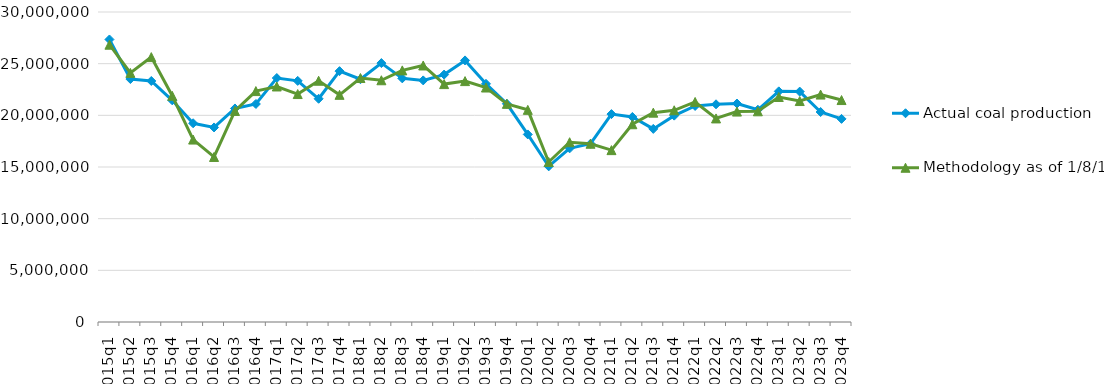
| Category | Actual coal production | Methodology as of 1/8/15 |
|---|---|---|
| 2015q1 | 27340454 | 26833955 |
| 2015q2 | 23512200 | 24104802 |
| 2015q3 | 23324791 | 25635984 |
| 2015q4 | 21455455 | 21891397 |
| 2016q1 | 19231525 | 17655143 |
| 2016q2 | 18828027 | 15972111 |
| 2016q3 | 20664387 | 20425248 |
| 2016q4 | 21099147 | 22346049 |
| 2017q1 | 23609782 | 22792704 |
| 2017q2 | 23333362 | 22059136 |
| 2017q3 | 21602662 | 23347446 |
| 2017q4 | 24275508 | 21983804 |
| 2018q1 | 23494518 | 23610445 |
| 2018q2 | 25056253 | 23393953 |
| 2018q3 | 23579079 | 24349639 |
| 2018q4 | 23380601 | 24824714 |
| 2019q1 | 23942990 | 23022795 |
| 2019q2 | 25314887 | 23312210 |
| 2019q3 | 23050391 | 22691817 |
| 2019q4 | 21117186 | 21109361 |
| 2020q1 | 18149806 | 20529732 |
| 2020q2 | 15062749 | 15486724 |
| 2020q3 | 16804240 | 17396200 |
| 2020q4 | 17252346 | 17251430 |
| 2021q1 | 20119068 | 16632158 |
| 2021q2 | 19842899 | 19138340 |
| 2021q3 | 18686644 | 20258003 |
| 2021q4 | 19971370 | 20489323 |
| 2022q1 | 20908422 | 21294004 |
| 2022q2 | 21068342 | 19700359 |
| 2022q3 | 21143748 | 20363520 |
| 2022q4 | 20539837 | 20389519 |
| 2023q1 | 22320481 | 21772698 |
| 2023q2 | 22298116 | 21383252 |
| 2023q3 | 20322537 | 22009196 |
| 2023q4 | 19656233 | 21478727 |